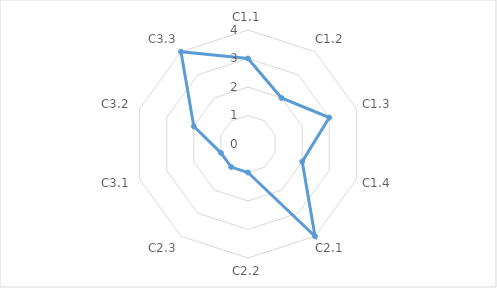
| Category | Series 0 |
|---|---|
| C1.1 | 3 |
| C1.2 | 2 |
| C1.3 | 3 |
| C1.4 | 2 |
| C2.1 | 4 |
| C2.2 | 1 |
| C2.3 | 1 |
| C3.1 | 1 |
| C3.2 | 2 |
| C3.3 | 4 |